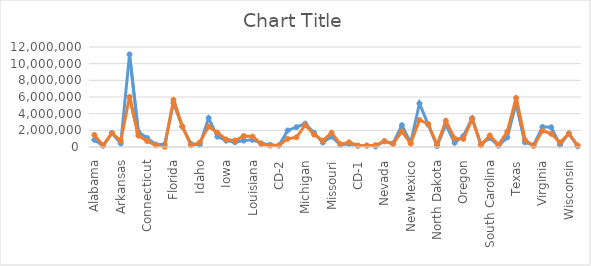
| Category | Biden  | Trump |
|---|---|---|
| Alabama | 849624 | 1441170 |
| Alaska | 153778 | 189951 |
| Arizona | 1672143 | 1661686 |
| Arkansas | 423932 | 760647 |
| California | 11110250 | 6006429 |
| Colorado | 1804352 | 1364607 |
| Connecticut | 1080680 | 715291 |
| Delaware | 296268 | 200603 |
| District of Columbia | 317323 | 18586 |
| Florida | 5297045 | 5668731 |
| Georgia | 2473633 | 2461854 |
| Hawaii | 366130 | 196864 |
| Idaho | 287021 | 554119 |
| Illinois | 3471915 | 2446891 |
| Indiana | 1242416 | 1729519 |
| Iowa | 759061 | 897672 |
| Kansas | 570323 | 771406 |
| Kentucky | 772474 | 1326646 |
| Louisiana | 856034 | 1255776 |
| Maine | 435072 | 360737 |
| CD-1 | 266376 | 164045 |
| CD-2 | 168696 | 196692 |
| Maryland | 1985023 | 976414 |
| Massachusetts | 2382202 | 1167202 |
| Michigan | 2804040 | 2649852 |
| Minnesota | 1717077 | 1484065 |
| Mississippi | 539398 | 756764 |
| Missouri | 1253014 | 1718736 |
| Montana | 244786 | 343602 |
| Nebraska | 374583 | 556846 |
| CD-1 | 132261 | 180290 |
| CD-2 | 176468 | 154377 |
| CD-3 | 65854 | 222179 |
| Nevada | 703486 | 669890 |
| New Hampshire | 424937 | 365660 |
| New Jersey | 2608335 | 1883274 |
| New Mexico | 501614 | 401894 |
| New York | 5230985 | 3244798 |
| North Carolina | 2684292 | 2758775 |
| North Dakota | 114902 | 235595 |
| Ohio | 2679165 | 3154834 |
| Oklahoma | 503890 | 1020280 |
| Oregon | 1340383 | 958448 |
| Pennsylvania | 3458229 | 3377674 |
| Rhode Island | 307486 | 199922 |
| South Carolina | 1091541 | 1385103 |
| South Dakota | 150471 | 261043 |
| Tennessee | 1143711 | 1852475 |
| Texas | 5259126 | 5890347 |
| Utah | 560282 | 865140 |
| Vermont | 242820 | 112704 |
| Virginia | 2413568 | 1962430 |
| Washington | 2369612 | 1584651 |
| West Virginia | 235984 | 545382 |
| Wisconsin | 1630866 | 1610184 |
| Wyoming | 73491 | 193559 |